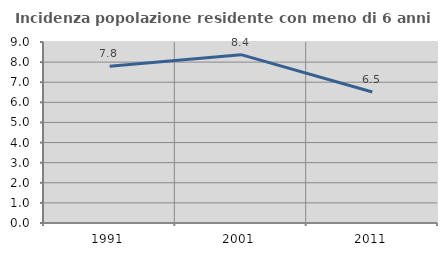
| Category | Incidenza popolazione residente con meno di 6 anni |
|---|---|
| 1991.0 | 7.794 |
| 2001.0 | 8.371 |
| 2011.0 | 6.515 |